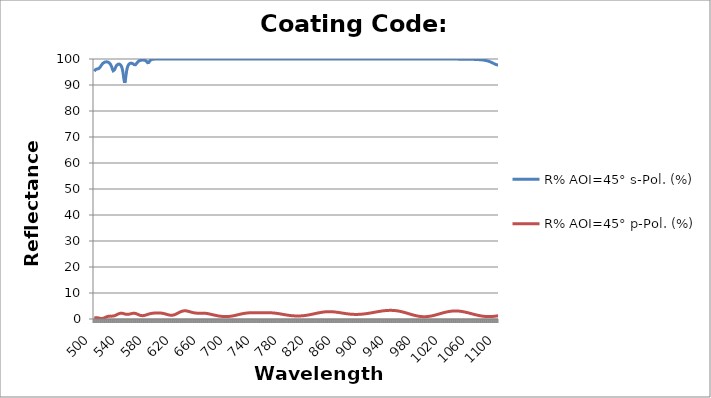
| Category | R% AOI=45° s-Pol. (%) | R% AOI=45° p-Pol. (%) |
|---|---|---|
| 500.0 | 95.27 | 0.367 |
| 501.0 | 95.703 | 0.437 |
| 502.0 | 95.967 | 0.485 |
| 503.0 | 96.106 | 0.506 |
| 504.0 | 96.165 | 0.498 |
| 505.0 | 96.194 | 0.463 |
| 506.0 | 96.254 | 0.409 |
| 507.0 | 96.403 | 0.344 |
| 508.0 | 96.669 | 0.279 |
| 509.0 | 97.032 | 0.224 |
| 510.0 | 97.433 | 0.19 |
| 511.0 | 97.816 | 0.183 |
| 512.0 | 98.144 | 0.208 |
| 513.0 | 98.405 | 0.265 |
| 514.0 | 98.602 | 0.35 |
| 515.0 | 98.745 | 0.457 |
| 516.0 | 98.84 | 0.577 |
| 517.0 | 98.895 | 0.7 |
| 518.0 | 98.914 | 0.817 |
| 519.0 | 98.896 | 0.918 |
| 520.0 | 98.838 | 1 |
| 521.0 | 98.732 | 1.058 |
| 522.0 | 98.566 | 1.092 |
| 523.0 | 98.316 | 1.107 |
| 524.0 | 97.951 | 1.108 |
| 525.0 | 97.437 | 1.103 |
| 526.0 | 96.762 | 1.1 |
| 527.0 | 96.012 | 1.109 |
| 528.0 | 95.458 | 1.135 |
| 529.0 | 95.411 | 1.184 |
| 530.0 | 95.858 | 1.259 |
| 531.0 | 96.495 | 1.357 |
| 532.0 | 97.074 | 1.475 |
| 533.0 | 97.512 | 1.607 |
| 534.0 | 97.808 | 1.744 |
| 535.0 | 97.986 | 1.877 |
| 536.0 | 98.064 | 1.997 |
| 537.0 | 98.049 | 2.097 |
| 538.0 | 97.936 | 2.17 |
| 539.0 | 97.7 | 2.212 |
| 540.0 | 97.296 | 2.223 |
| 541.0 | 96.635 | 2.204 |
| 542.0 | 95.579 | 2.16 |
| 543.0 | 93.981 | 2.096 |
| 544.0 | 92.007 | 2.022 |
| 545.0 | 90.827 | 1.946 |
| 546.0 | 91.725 | 1.876 |
| 547.0 | 93.756 | 1.82 |
| 548.0 | 95.518 | 1.783 |
| 549.0 | 96.698 | 1.77 |
| 550.0 | 97.438 | 1.781 |
| 551.0 | 97.897 | 1.816 |
| 552.0 | 98.177 | 1.869 |
| 553.0 | 98.337 | 1.935 |
| 554.0 | 98.409 | 2.008 |
| 555.0 | 98.408 | 2.08 |
| 556.0 | 98.341 | 2.142 |
| 557.0 | 98.213 | 2.188 |
| 558.0 | 98.034 | 2.212 |
| 559.0 | 97.844 | 2.211 |
| 560.0 | 97.723 | 2.184 |
| 561.0 | 97.775 | 2.13 |
| 562.0 | 98.024 | 2.052 |
| 563.0 | 98.379 | 1.955 |
| 564.0 | 98.725 | 1.845 |
| 565.0 | 99.003 | 1.728 |
| 566.0 | 99.208 | 1.612 |
| 567.0 | 99.353 | 1.504 |
| 568.0 | 99.452 | 1.414 |
| 569.0 | 99.517 | 1.35 |
| 570.0 | 99.559 | 1.306 |
| 571.0 | 99.583 | 1.285 |
| 572.0 | 99.59 | 1.286 |
| 573.0 | 99.58 | 1.309 |
| 574.0 | 99.55 | 1.352 |
| 575.0 | 99.492 | 1.412 |
| 576.0 | 99.394 | 1.486 |
| 577.0 | 99.228 | 1.569 |
| 578.0 | 98.96 | 1.658 |
| 579.0 | 98.589 | 1.749 |
| 580.0 | 98.372 | 1.837 |
| 581.0 | 98.686 | 1.92 |
| 582.0 | 99.193 | 1.996 |
| 583.0 | 99.532 | 2.063 |
| 584.0 | 99.718 | 2.12 |
| 585.0 | 99.819 | 2.168 |
| 586.0 | 99.877 | 2.206 |
| 587.0 | 99.913 | 2.236 |
| 588.0 | 99.935 | 2.26 |
| 589.0 | 99.95 | 2.279 |
| 590.0 | 99.96 | 2.294 |
| 591.0 | 99.968 | 2.305 |
| 592.0 | 99.973 | 2.314 |
| 593.0 | 99.977 | 2.319 |
| 594.0 | 99.98 | 2.322 |
| 595.0 | 99.982 | 2.322 |
| 596.0 | 99.984 | 2.319 |
| 597.0 | 99.986 | 2.31 |
| 598.0 | 99.987 | 2.296 |
| 599.0 | 99.988 | 2.274 |
| 600.0 | 99.988 | 2.244 |
| 601.0 | 99.989 | 2.206 |
| 602.0 | 99.989 | 2.16 |
| 603.0 | 99.989 | 2.104 |
| 604.0 | 99.989 | 2.041 |
| 605.0 | 99.989 | 1.97 |
| 606.0 | 99.988 | 1.895 |
| 607.0 | 99.988 | 1.817 |
| 608.0 | 99.987 | 1.739 |
| 609.0 | 99.986 | 1.664 |
| 610.0 | 99.985 | 1.595 |
| 611.0 | 99.984 | 1.535 |
| 612.0 | 99.982 | 1.488 |
| 613.0 | 99.98 | 1.455 |
| 614.0 | 99.977 | 1.439 |
| 615.0 | 99.974 | 1.442 |
| 616.0 | 99.97 | 1.466 |
| 617.0 | 99.967 | 1.51 |
| 618.0 | 99.965 | 1.574 |
| 619.0 | 99.964 | 1.656 |
| 620.0 | 99.965 | 1.756 |
| 621.0 | 99.967 | 1.87 |
| 622.0 | 99.97 | 1.996 |
| 623.0 | 99.974 | 2.129 |
| 624.0 | 99.977 | 2.266 |
| 625.0 | 99.98 | 2.404 |
| 626.0 | 99.983 | 2.539 |
| 627.0 | 99.985 | 2.666 |
| 628.0 | 99.987 | 2.783 |
| 629.0 | 99.988 | 2.888 |
| 630.0 | 99.989 | 2.976 |
| 631.0 | 99.99 | 3.048 |
| 632.0 | 99.991 | 3.101 |
| 633.0 | 99.991 | 3.135 |
| 634.0 | 99.992 | 3.151 |
| 635.0 | 99.992 | 3.148 |
| 636.0 | 99.992 | 3.129 |
| 637.0 | 99.992 | 3.094 |
| 638.0 | 99.992 | 3.046 |
| 639.0 | 99.992 | 2.987 |
| 640.0 | 99.992 | 2.92 |
| 641.0 | 99.992 | 2.847 |
| 642.0 | 99.992 | 2.771 |
| 643.0 | 99.991 | 2.694 |
| 644.0 | 99.991 | 2.619 |
| 645.0 | 99.99 | 2.547 |
| 646.0 | 99.989 | 2.482 |
| 647.0 | 99.988 | 2.423 |
| 648.0 | 99.987 | 2.372 |
| 649.0 | 99.985 | 2.329 |
| 650.0 | 99.984 | 2.295 |
| 651.0 | 99.981 | 2.269 |
| 652.0 | 99.979 | 2.252 |
| 653.0 | 99.976 | 2.241 |
| 654.0 | 99.973 | 2.236 |
| 655.0 | 99.97 | 2.235 |
| 656.0 | 99.967 | 2.238 |
| 657.0 | 99.965 | 2.242 |
| 658.0 | 99.964 | 2.247 |
| 659.0 | 99.964 | 2.251 |
| 660.0 | 99.965 | 2.252 |
| 661.0 | 99.967 | 2.25 |
| 662.0 | 99.969 | 2.244 |
| 663.0 | 99.971 | 2.232 |
| 664.0 | 99.973 | 2.214 |
| 665.0 | 99.975 | 2.19 |
| 666.0 | 99.977 | 2.16 |
| 667.0 | 99.978 | 2.124 |
| 668.0 | 99.979 | 2.082 |
| 669.0 | 99.98 | 2.034 |
| 670.0 | 99.981 | 1.982 |
| 671.0 | 99.981 | 1.924 |
| 672.0 | 99.981 | 1.864 |
| 673.0 | 99.981 | 1.8 |
| 674.0 | 99.981 | 1.74 |
| 675.0 | 99.981 | 1.681 |
| 676.0 | 99.98 | 1.621 |
| 677.0 | 99.979 | 1.563 |
| 678.0 | 99.978 | 1.506 |
| 679.0 | 99.977 | 1.448 |
| 680.0 | 99.975 | 1.392 |
| 681.0 | 99.974 | 1.338 |
| 682.0 | 99.972 | 1.286 |
| 683.0 | 99.97 | 1.236 |
| 684.0 | 99.968 | 1.19 |
| 685.0 | 99.966 | 1.146 |
| 686.0 | 99.965 | 1.106 |
| 687.0 | 99.964 | 1.069 |
| 688.0 | 99.964 | 1.036 |
| 689.0 | 99.965 | 1.007 |
| 690.0 | 99.967 | 0.982 |
| 691.0 | 99.969 | 0.962 |
| 692.0 | 99.971 | 0.946 |
| 693.0 | 99.974 | 0.934 |
| 694.0 | 99.976 | 0.928 |
| 695.0 | 99.979 | 0.926 |
| 696.0 | 99.981 | 0.929 |
| 697.0 | 99.983 | 0.937 |
| 698.0 | 99.984 | 0.95 |
| 699.0 | 99.986 | 0.968 |
| 700.0 | 99.987 | 0.99 |
| 701.0 | 99.988 | 1.018 |
| 702.0 | 99.989 | 1.05 |
| 703.0 | 99.99 | 1.087 |
| 704.0 | 99.99 | 1.128 |
| 705.0 | 99.991 | 1.174 |
| 706.0 | 99.991 | 1.223 |
| 707.0 | 99.992 | 1.275 |
| 708.0 | 99.992 | 1.33 |
| 709.0 | 99.992 | 1.388 |
| 710.0 | 99.992 | 1.448 |
| 711.0 | 99.992 | 1.509 |
| 712.0 | 99.993 | 1.572 |
| 713.0 | 99.993 | 1.634 |
| 714.0 | 99.993 | 1.697 |
| 715.0 | 99.992 | 1.759 |
| 716.0 | 99.992 | 1.82 |
| 717.0 | 99.992 | 1.88 |
| 718.0 | 99.992 | 1.937 |
| 719.0 | 99.992 | 1.992 |
| 720.0 | 99.992 | 2.045 |
| 721.0 | 99.991 | 2.094 |
| 722.0 | 99.991 | 2.14 |
| 723.0 | 99.99 | 2.182 |
| 724.0 | 99.989 | 2.221 |
| 725.0 | 99.989 | 2.256 |
| 726.0 | 99.988 | 2.287 |
| 727.0 | 99.987 | 2.315 |
| 728.0 | 99.986 | 2.339 |
| 729.0 | 99.984 | 2.359 |
| 730.0 | 99.983 | 2.376 |
| 731.0 | 99.981 | 2.391 |
| 732.0 | 99.979 | 2.402 |
| 733.0 | 99.977 | 2.412 |
| 734.0 | 99.975 | 2.418 |
| 735.0 | 99.973 | 2.424 |
| 736.0 | 99.971 | 2.427 |
| 737.0 | 99.969 | 2.43 |
| 738.0 | 99.967 | 2.431 |
| 739.0 | 99.966 | 2.432 |
| 740.0 | 99.965 | 2.432 |
| 741.0 | 99.965 | 2.433 |
| 742.0 | 99.965 | 2.433 |
| 743.0 | 99.966 | 2.433 |
| 744.0 | 99.967 | 2.434 |
| 745.0 | 99.968 | 2.435 |
| 746.0 | 99.97 | 2.436 |
| 747.0 | 99.972 | 2.437 |
| 748.0 | 99.973 | 2.439 |
| 749.0 | 99.975 | 2.441 |
| 750.0 | 99.976 | 2.443 |
| 751.0 | 99.977 | 2.444 |
| 752.0 | 99.978 | 2.445 |
| 753.0 | 99.979 | 2.446 |
| 754.0 | 99.98 | 2.446 |
| 755.0 | 99.981 | 2.445 |
| 756.0 | 99.982 | 2.442 |
| 757.0 | 99.982 | 2.438 |
| 758.0 | 99.983 | 2.433 |
| 759.0 | 99.983 | 2.426 |
| 760.0 | 99.984 | 2.416 |
| 761.0 | 99.984 | 2.405 |
| 762.0 | 99.984 | 2.391 |
| 763.0 | 99.984 | 2.375 |
| 764.0 | 99.984 | 2.357 |
| 765.0 | 99.984 | 2.336 |
| 766.0 | 99.984 | 2.312 |
| 767.0 | 99.985 | 2.286 |
| 768.0 | 99.985 | 2.257 |
| 769.0 | 99.985 | 2.226 |
| 770.0 | 99.985 | 2.193 |
| 771.0 | 99.985 | 2.158 |
| 772.0 | 99.985 | 2.12 |
| 773.0 | 99.985 | 2.081 |
| 774.0 | 99.985 | 2.041 |
| 775.0 | 99.985 | 1.999 |
| 776.0 | 99.985 | 1.955 |
| 777.0 | 99.986 | 1.911 |
| 778.0 | 99.986 | 1.867 |
| 779.0 | 99.986 | 1.821 |
| 780.0 | 99.986 | 1.776 |
| 781.0 | 99.987 | 1.731 |
| 782.0 | 99.987 | 1.686 |
| 783.0 | 99.987 | 1.642 |
| 784.0 | 99.988 | 1.598 |
| 785.0 | 99.988 | 1.555 |
| 786.0 | 99.988 | 1.513 |
| 787.0 | 99.989 | 1.473 |
| 788.0 | 99.989 | 1.435 |
| 789.0 | 99.989 | 1.399 |
| 790.0 | 99.99 | 1.364 |
| 791.0 | 99.99 | 1.332 |
| 792.0 | 99.99 | 1.303 |
| 793.0 | 99.99 | 1.275 |
| 794.0 | 99.991 | 1.251 |
| 795.0 | 99.991 | 1.229 |
| 796.0 | 99.991 | 1.21 |
| 797.0 | 99.991 | 1.194 |
| 798.0 | 99.991 | 1.181 |
| 799.0 | 99.991 | 1.17 |
| 800.0 | 99.992 | 1.164 |
| 801.0 | 99.992 | 1.16 |
| 802.0 | 99.992 | 1.159 |
| 803.0 | 99.992 | 1.162 |
| 804.0 | 99.992 | 1.167 |
| 805.0 | 99.992 | 1.176 |
| 806.0 | 99.992 | 1.189 |
| 807.0 | 99.992 | 1.204 |
| 808.0 | 99.992 | 1.223 |
| 809.0 | 99.991 | 1.244 |
| 810.0 | 99.991 | 1.27 |
| 811.0 | 99.991 | 1.298 |
| 812.0 | 99.991 | 1.328 |
| 813.0 | 99.991 | 1.362 |
| 814.0 | 99.99 | 1.399 |
| 815.0 | 99.99 | 1.438 |
| 816.0 | 99.99 | 1.48 |
| 817.0 | 99.989 | 1.524 |
| 818.0 | 99.989 | 1.57 |
| 819.0 | 99.988 | 1.619 |
| 820.0 | 99.988 | 1.669 |
| 821.0 | 99.987 | 1.721 |
| 822.0 | 99.986 | 1.774 |
| 823.0 | 99.986 | 1.828 |
| 824.0 | 99.985 | 1.884 |
| 825.0 | 99.984 | 1.939 |
| 826.0 | 99.983 | 1.996 |
| 827.0 | 99.982 | 2.052 |
| 828.0 | 99.98 | 2.108 |
| 829.0 | 99.979 | 2.163 |
| 830.0 | 99.978 | 2.218 |
| 831.0 | 99.976 | 2.271 |
| 832.0 | 99.975 | 2.323 |
| 833.0 | 99.973 | 2.374 |
| 834.0 | 99.971 | 2.422 |
| 835.0 | 99.97 | 2.469 |
| 836.0 | 99.968 | 2.515 |
| 837.0 | 99.967 | 2.558 |
| 838.0 | 99.966 | 2.598 |
| 839.0 | 99.965 | 2.635 |
| 840.0 | 99.964 | 2.669 |
| 841.0 | 99.964 | 2.7 |
| 842.0 | 99.964 | 2.727 |
| 843.0 | 99.964 | 2.751 |
| 844.0 | 99.964 | 2.771 |
| 845.0 | 99.965 | 2.787 |
| 846.0 | 99.966 | 2.799 |
| 847.0 | 99.967 | 2.808 |
| 848.0 | 99.968 | 2.813 |
| 849.0 | 99.97 | 2.814 |
| 850.0 | 99.971 | 2.81 |
| 851.0 | 99.972 | 2.804 |
| 852.0 | 99.973 | 2.794 |
| 853.0 | 99.974 | 2.78 |
| 854.0 | 99.975 | 2.763 |
| 855.0 | 99.976 | 2.742 |
| 856.0 | 99.977 | 2.719 |
| 857.0 | 99.978 | 2.692 |
| 858.0 | 99.979 | 2.664 |
| 859.0 | 99.98 | 2.632 |
| 860.0 | 99.98 | 2.599 |
| 861.0 | 99.981 | 2.563 |
| 862.0 | 99.981 | 2.526 |
| 863.0 | 99.982 | 2.488 |
| 864.0 | 99.982 | 2.448 |
| 865.0 | 99.982 | 2.408 |
| 866.0 | 99.983 | 2.366 |
| 867.0 | 99.983 | 2.325 |
| 868.0 | 99.983 | 2.283 |
| 869.0 | 99.983 | 2.242 |
| 870.0 | 99.984 | 2.201 |
| 871.0 | 99.984 | 2.161 |
| 872.0 | 99.984 | 2.121 |
| 873.0 | 99.984 | 2.083 |
| 874.0 | 99.984 | 2.046 |
| 875.0 | 99.984 | 2.011 |
| 876.0 | 99.983 | 1.978 |
| 877.0 | 99.983 | 1.946 |
| 878.0 | 99.983 | 1.917 |
| 879.0 | 99.983 | 1.89 |
| 880.0 | 99.983 | 1.865 |
| 881.0 | 99.982 | 1.843 |
| 882.0 | 99.982 | 1.823 |
| 883.0 | 99.982 | 1.806 |
| 884.0 | 99.981 | 1.792 |
| 885.0 | 99.981 | 1.78 |
| 886.0 | 99.98 | 1.772 |
| 887.0 | 99.98 | 1.766 |
| 888.0 | 99.979 | 1.763 |
| 889.0 | 99.979 | 1.763 |
| 890.0 | 99.978 | 1.766 |
| 891.0 | 99.978 | 1.771 |
| 892.0 | 99.977 | 1.78 |
| 893.0 | 99.976 | 1.791 |
| 894.0 | 99.976 | 1.805 |
| 895.0 | 99.975 | 1.821 |
| 896.0 | 99.974 | 1.84 |
| 897.0 | 99.973 | 1.862 |
| 898.0 | 99.972 | 1.886 |
| 899.0 | 99.972 | 1.912 |
| 900.0 | 99.971 | 1.94 |
| 901.0 | 99.97 | 1.971 |
| 902.0 | 99.969 | 2.004 |
| 903.0 | 99.969 | 2.038 |
| 904.0 | 99.968 | 2.074 |
| 905.0 | 99.967 | 2.112 |
| 906.0 | 99.967 | 2.152 |
| 907.0 | 99.966 | 2.192 |
| 908.0 | 99.966 | 2.235 |
| 909.0 | 99.965 | 2.278 |
| 910.0 | 99.965 | 2.322 |
| 911.0 | 99.965 | 2.367 |
| 912.0 | 99.964 | 2.413 |
| 913.0 | 99.964 | 2.46 |
| 914.0 | 99.964 | 2.506 |
| 915.0 | 99.964 | 2.553 |
| 916.0 | 99.964 | 2.6 |
| 917.0 | 99.964 | 2.648 |
| 918.0 | 99.964 | 2.694 |
| 919.0 | 99.965 | 2.741 |
| 920.0 | 99.965 | 2.787 |
| 921.0 | 99.965 | 2.832 |
| 922.0 | 99.965 | 2.876 |
| 923.0 | 99.966 | 2.919 |
| 924.0 | 99.966 | 2.961 |
| 925.0 | 99.966 | 3.002 |
| 926.0 | 99.966 | 3.04 |
| 927.0 | 99.967 | 3.078 |
| 928.0 | 99.967 | 3.113 |
| 929.0 | 99.967 | 3.146 |
| 930.0 | 99.967 | 3.177 |
| 931.0 | 99.968 | 3.205 |
| 932.0 | 99.968 | 3.231 |
| 933.0 | 99.968 | 3.254 |
| 934.0 | 99.968 | 3.274 |
| 935.0 | 99.968 | 3.291 |
| 936.0 | 99.968 | 3.305 |
| 937.0 | 99.968 | 3.316 |
| 938.0 | 99.968 | 3.322 |
| 939.0 | 99.968 | 3.326 |
| 940.0 | 99.968 | 3.326 |
| 941.0 | 99.968 | 3.322 |
| 942.0 | 99.968 | 3.314 |
| 943.0 | 99.968 | 3.302 |
| 944.0 | 99.968 | 3.287 |
| 945.0 | 99.968 | 3.267 |
| 946.0 | 99.968 | 3.244 |
| 947.0 | 99.968 | 3.216 |
| 948.0 | 99.968 | 3.185 |
| 949.0 | 99.968 | 3.15 |
| 950.0 | 99.968 | 3.111 |
| 951.0 | 99.967 | 3.068 |
| 952.0 | 99.967 | 3.021 |
| 953.0 | 99.967 | 2.971 |
| 954.0 | 99.967 | 2.918 |
| 955.0 | 99.966 | 2.861 |
| 956.0 | 99.966 | 2.802 |
| 957.0 | 99.966 | 2.739 |
| 958.0 | 99.966 | 2.674 |
| 959.0 | 99.966 | 2.606 |
| 960.0 | 99.966 | 2.536 |
| 961.0 | 99.965 | 2.464 |
| 962.0 | 99.965 | 2.39 |
| 963.0 | 99.965 | 2.315 |
| 964.0 | 99.965 | 2.239 |
| 965.0 | 99.965 | 2.162 |
| 966.0 | 99.965 | 2.084 |
| 967.0 | 99.964 | 2.006 |
| 968.0 | 99.964 | 1.928 |
| 969.0 | 99.964 | 1.851 |
| 970.0 | 99.964 | 1.775 |
| 971.0 | 99.964 | 1.7 |
| 972.0 | 99.964 | 1.626 |
| 973.0 | 99.965 | 1.554 |
| 974.0 | 99.965 | 1.484 |
| 975.0 | 99.965 | 1.417 |
| 976.0 | 99.965 | 1.353 |
| 977.0 | 99.965 | 1.292 |
| 978.0 | 99.965 | 1.234 |
| 979.0 | 99.966 | 1.179 |
| 980.0 | 99.966 | 1.129 |
| 981.0 | 99.966 | 1.083 |
| 982.0 | 99.966 | 1.041 |
| 983.0 | 99.966 | 1.004 |
| 984.0 | 99.967 | 0.972 |
| 985.0 | 99.967 | 0.944 |
| 986.0 | 99.967 | 0.922 |
| 987.0 | 99.968 | 0.905 |
| 988.0 | 99.968 | 0.893 |
| 989.0 | 99.968 | 0.887 |
| 990.0 | 99.968 | 0.886 |
| 991.0 | 99.968 | 0.89 |
| 992.0 | 99.969 | 0.9 |
| 993.0 | 99.969 | 0.915 |
| 994.0 | 99.969 | 0.935 |
| 995.0 | 99.969 | 0.961 |
| 996.0 | 99.97 | 0.991 |
| 997.0 | 99.97 | 1.026 |
| 998.0 | 99.97 | 1.066 |
| 999.0 | 99.97 | 1.11 |
| 1000.0 | 99.97 | 1.159 |
| 1001.0 | 99.97 | 1.211 |
| 1002.0 | 99.97 | 1.267 |
| 1003.0 | 99.971 | 1.327 |
| 1004.0 | 99.971 | 1.39 |
| 1005.0 | 99.971 | 1.455 |
| 1006.0 | 99.971 | 1.523 |
| 1007.0 | 99.971 | 1.593 |
| 1008.0 | 99.971 | 1.665 |
| 1009.0 | 99.971 | 1.738 |
| 1010.0 | 99.971 | 1.812 |
| 1011.0 | 99.97 | 1.887 |
| 1012.0 | 99.97 | 1.963 |
| 1013.0 | 99.97 | 2.038 |
| 1014.0 | 99.97 | 2.113 |
| 1015.0 | 99.97 | 2.188 |
| 1016.0 | 99.97 | 2.261 |
| 1017.0 | 99.969 | 2.333 |
| 1018.0 | 99.969 | 2.403 |
| 1019.0 | 99.969 | 2.471 |
| 1020.0 | 99.968 | 2.537 |
| 1021.0 | 99.968 | 2.601 |
| 1022.0 | 99.968 | 2.661 |
| 1023.0 | 99.967 | 2.718 |
| 1024.0 | 99.967 | 2.772 |
| 1025.0 | 99.966 | 2.823 |
| 1026.0 | 99.966 | 2.869 |
| 1027.0 | 99.965 | 2.912 |
| 1028.0 | 99.964 | 2.95 |
| 1029.0 | 99.964 | 2.984 |
| 1030.0 | 99.963 | 3.014 |
| 1031.0 | 99.962 | 3.039 |
| 1032.0 | 99.961 | 3.06 |
| 1033.0 | 99.96 | 3.076 |
| 1034.0 | 99.959 | 3.087 |
| 1035.0 | 99.958 | 3.093 |
| 1036.0 | 99.957 | 3.095 |
| 1037.0 | 99.956 | 3.092 |
| 1038.0 | 99.954 | 3.084 |
| 1039.0 | 99.953 | 3.071 |
| 1040.0 | 99.952 | 3.054 |
| 1041.0 | 99.95 | 3.033 |
| 1042.0 | 99.948 | 3.007 |
| 1043.0 | 99.946 | 2.977 |
| 1044.0 | 99.944 | 2.943 |
| 1045.0 | 99.942 | 2.905 |
| 1046.0 | 99.94 | 2.863 |
| 1047.0 | 99.938 | 2.817 |
| 1048.0 | 99.935 | 2.769 |
| 1049.0 | 99.932 | 2.717 |
| 1050.0 | 99.929 | 2.662 |
| 1051.0 | 99.926 | 2.605 |
| 1052.0 | 99.923 | 2.545 |
| 1053.0 | 99.919 | 2.483 |
| 1054.0 | 99.915 | 2.42 |
| 1055.0 | 99.911 | 2.354 |
| 1056.0 | 99.906 | 2.288 |
| 1057.0 | 99.901 | 2.22 |
| 1058.0 | 99.895 | 2.152 |
| 1059.0 | 99.889 | 2.083 |
| 1060.0 | 99.883 | 2.014 |
| 1061.0 | 99.876 | 1.946 |
| 1062.0 | 99.868 | 1.877 |
| 1063.0 | 99.86 | 1.81 |
| 1064.0 | 99.85 | 1.743 |
| 1065.0 | 99.84 | 1.678 |
| 1066.0 | 99.829 | 1.613 |
| 1067.0 | 99.817 | 1.551 |
| 1068.0 | 99.804 | 1.491 |
| 1069.0 | 99.789 | 1.433 |
| 1070.0 | 99.773 | 1.377 |
| 1071.0 | 99.755 | 1.324 |
| 1072.0 | 99.735 | 1.273 |
| 1073.0 | 99.713 | 1.226 |
| 1074.0 | 99.689 | 1.182 |
| 1075.0 | 99.662 | 1.141 |
| 1076.0 | 99.632 | 1.103 |
| 1077.0 | 99.598 | 1.069 |
| 1078.0 | 99.561 | 1.039 |
| 1079.0 | 99.519 | 1.012 |
| 1080.0 | 99.472 | 0.989 |
| 1081.0 | 99.42 | 0.97 |
| 1082.0 | 99.362 | 0.955 |
| 1083.0 | 99.296 | 0.943 |
| 1084.0 | 99.224 | 0.936 |
| 1085.0 | 99.144 | 0.932 |
| 1086.0 | 99.055 | 0.932 |
| 1087.0 | 98.958 | 0.935 |
| 1088.0 | 98.852 | 0.942 |
| 1089.0 | 98.737 | 0.953 |
| 1090.0 | 98.616 | 0.967 |
| 1091.0 | 98.488 | 0.984 |
| 1092.0 | 98.358 | 1.005 |
| 1093.0 | 98.228 | 1.029 |
| 1094.0 | 98.101 | 1.055 |
| 1095.0 | 97.984 | 1.084 |
| 1096.0 | 97.879 | 1.116 |
| 1097.0 | 97.792 | 1.15 |
| 1098.0 | 97.726 | 1.186 |
| 1099.0 | 97.683 | 1.225 |
| 1100.0 | 97.662 | 1.265 |